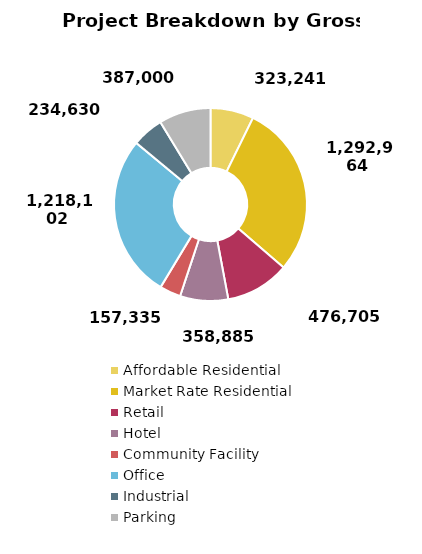
| Category | Series 0 |
|---|---|
| Affordable Residential | 323241.015 |
| Market Rate Residential | 1292964.06 |
| Retail | 476705 |
| Hotel | 358884.813 |
| Community Facility | 157335 |
| Office | 1218102.111 |
| Industrial | 234630 |
| Parking | 387000 |